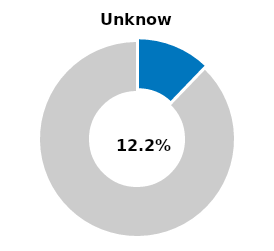
| Category | Series 0 |
|---|---|
| Unknown | 0.122 |
| Other | 0.879 |